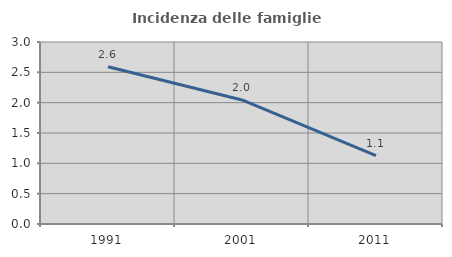
| Category | Incidenza delle famiglie numerose |
|---|---|
| 1991.0 | 2.593 |
| 2001.0 | 2.045 |
| 2011.0 | 1.126 |